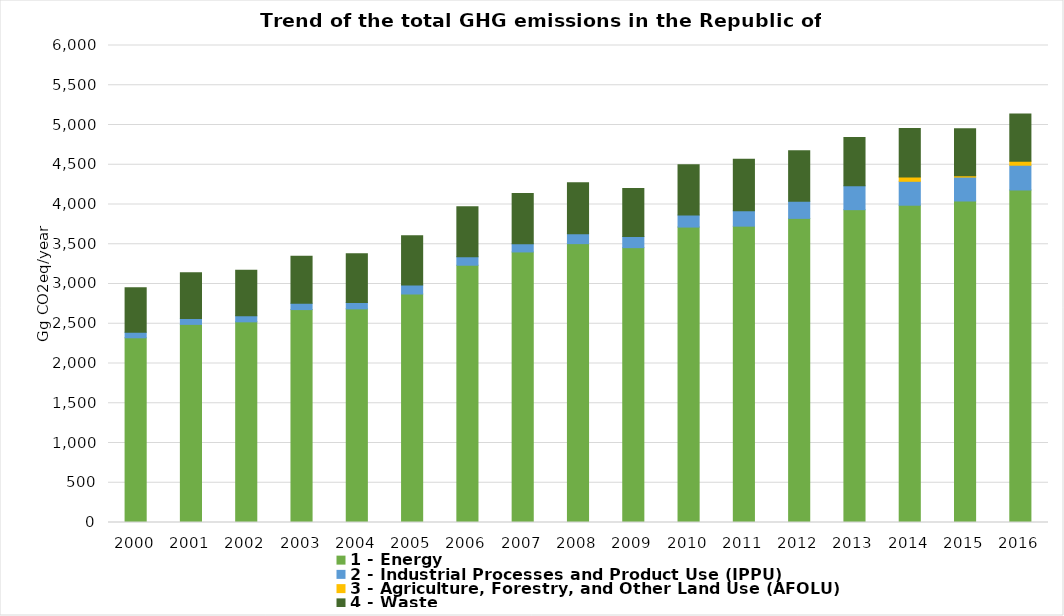
| Category | 1 - Energy | 2 - Industrial Processes and Product Use (IPPU) | 3 - Agriculture, Forestry, and Other Land Use (AFOLU) | 4 - Waste |
|---|---|---|---|---|
| 2000.0 | 2323.151 | 70.318 | -23.982 | 560.248 |
| 2001.0 | 2492.095 | 73.464 | -30.574 | 574.805 |
| 2002.0 | 2523.992 | 76.149 | -31.285 | 573.576 |
| 2003.0 | 2678.11 | 78.885 | -30.683 | 593.241 |
| 2004.0 | 2687.201 | 81.249 | -32.058 | 612.666 |
| 2005.0 | 2874.169 | 113.158 | -34.107 | 619.697 |
| 2006.0 | 3236.141 | 108.037 | -33.047 | 626.236 |
| 2007.0 | 3403.206 | 103.252 | -33.563 | 633.448 |
| 2008.0 | 3507.709 | 125.868 | -20.267 | 640.547 |
| 2009.0 | 3457.07 | 139.56 | -20.841 | 603.148 |
| 2010.0 | 3715.957 | 151.712 | -16.255 | 631.438 |
| 2011.0 | 3727.56 | 193.95 | -2.117 | 646.124 |
| 2012.0 | 3825.398 | 214.429 | -4.674 | 637.034 |
| 2013.0 | 3935.072 | 300.001 | -2.075 | 608.448 |
| 2014.0 | 3990.894 | 300.784 | 55.204 | 610.348 |
| 2015.0 | 4043.994 | 300.956 | 17.987 | 590.735 |
| 2016.0 | 4182.617 | 311.181 | 51.177 | 592.809 |